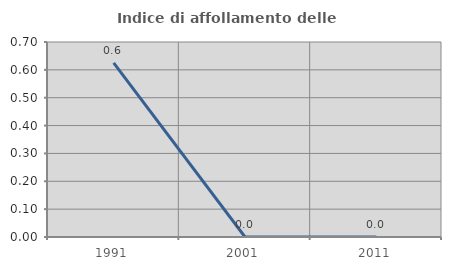
| Category | Indice di affollamento delle abitazioni  |
|---|---|
| 1991.0 | 0.625 |
| 2001.0 | 0 |
| 2011.0 | 0 |